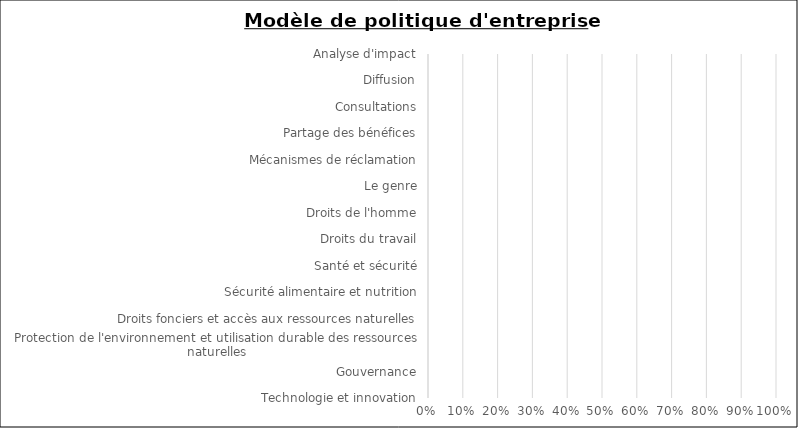
| Category | Red | Yellow | Green |
|---|---|---|---|
| Analyse d'impact | 0 | 0 | 0 |
| Diffusion | 0 | 0 | 0 |
| Consultations | 0 | 0 | 0 |
| Partage des bénéfices | 0 | 0 | 0 |
| Mécanismes de réclamation | 0 | 0 | 0 |
| Le genre | 0 | 0 | 0 |
| Droits de l'homme | 0 | 0 | 0 |
| Droits du travail | 0 | 0 | 0 |
| Santé et sécurité | 0 | 0 | 0 |
| Sécurité alimentaire et nutrition | 0 | 0 | 0 |
| Droits fonciers et accès aux ressources naturelles | 0 | 0 | 0 |
| Protection de l'environnement et utilisation durable des ressources naturelles | 0 | 0 | 0 |
| Gouvernance | 0 | 0 | 0 |
| Technologie et innovation | 0 | 0 | 0 |